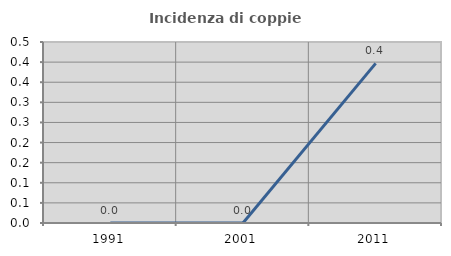
| Category | Incidenza di coppie miste |
|---|---|
| 1991.0 | 0 |
| 2001.0 | 0 |
| 2011.0 | 0.397 |